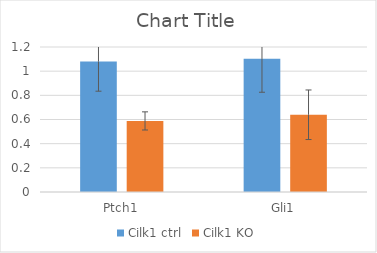
| Category | Cilk1 ctrl | Cilk1 KO |
|---|---|---|
| Ptch1 | 1.08 | 0.588 |
| Gli1 | 1.102 | 0.639 |